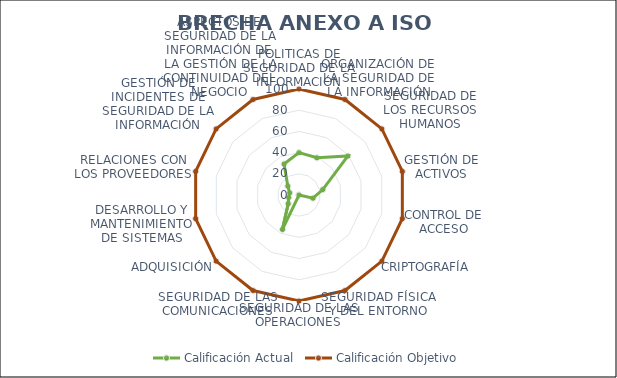
| Category | Calificación Actual | Calificación Objetivo |
|---|---|---|
| 0 | 40 | 100 |
| 1 | 39 | 100 |
| 2 | 59 | 100 |
| 3 | 23 | 100 |
| 4 | 13.5 | 100 |
| 5 | 0 | 100 |
| 6 | 0 | 100 |
| 7 | 0 | 100 |
| 8 | 36 | 100 |
| 9 | 13 | 100 |
| 10 | 10 | 100 |
| 11 | 9 | 100 |
| 12 | 13.5 | 100 |
| 13 | 32.5 | 100 |